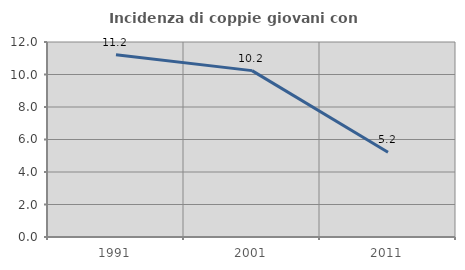
| Category | Incidenza di coppie giovani con figli |
|---|---|
| 1991.0 | 11.218 |
| 2001.0 | 10.239 |
| 2011.0 | 5.212 |